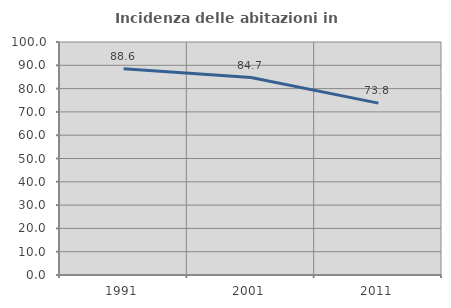
| Category | Incidenza delle abitazioni in proprietà  |
|---|---|
| 1991.0 | 88.556 |
| 2001.0 | 84.738 |
| 2011.0 | 73.775 |